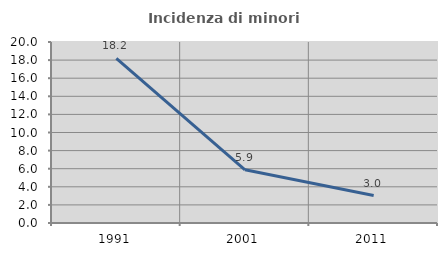
| Category | Incidenza di minori stranieri |
|---|---|
| 1991.0 | 18.182 |
| 2001.0 | 5.882 |
| 2011.0 | 3.03 |